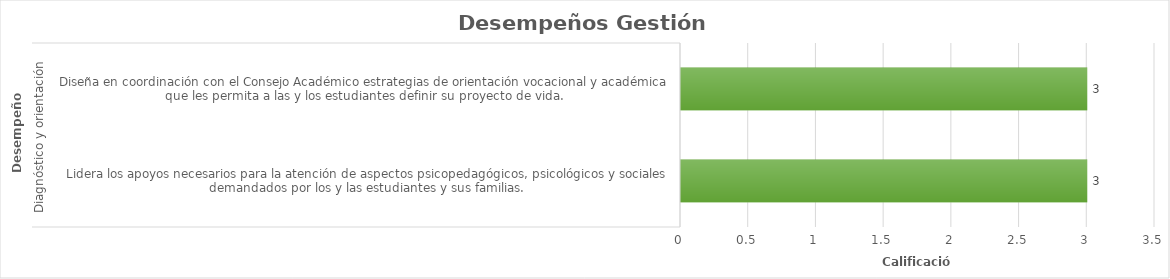
| Category | Series 0 |
|---|---|
| 0 | 3 |
| 1 | 3 |